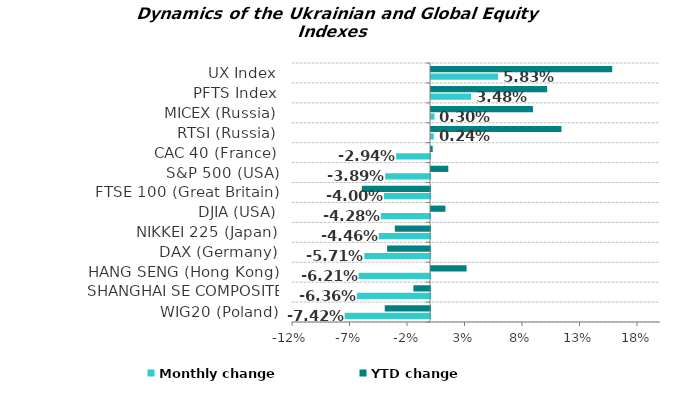
| Category | Monthly change | YTD change |
|---|---|---|
| WIG20 (Poland) | -0.074 | -0.039 |
| SHANGHAI SE COMPOSITE (China) | -0.064 | -0.014 |
| HANG SENG (Hong Kong) | -0.062 | 0.031 |
| DAX (Germany) | -0.057 | -0.037 |
| NIKKEI 225 (Japan) | -0.045 | -0.031 |
| DJIA (USA) | -0.043 | 0.013 |
| FTSE 100 (Great Britain) | -0.04 | -0.059 |
| S&P 500 (USA) | -0.039 | 0.015 |
| CAC 40 (France) | -0.029 | 0.001 |
| RTSI (Russia) | 0.002 | 0.114 |
| MICEX (Russia) | 0.003 | 0.089 |
| PFTS Index | 0.035 | 0.101 |
| UX Index | 0.058 | 0.158 |